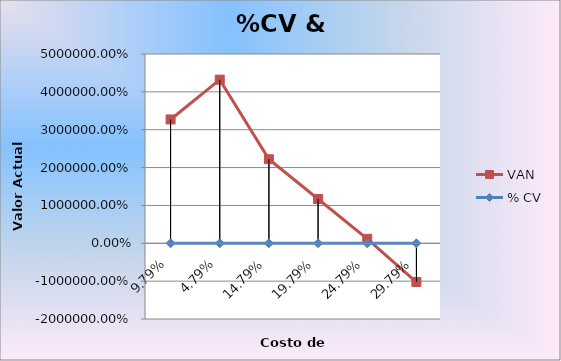
| Category | VAN | % CV |
|---|---|---|
| 0.0979 | 32707.281 | 0.098 |
| 0.0479 | 43219.321 | 0.048 |
| 0.1479 | 22205.231 | 0.148 |
| 0.1979 | 11698.187 | 0.198 |
| 0.2479 | 1191.142 | 0.248 |
| 0.2979 | -10228.196 | 0.298 |